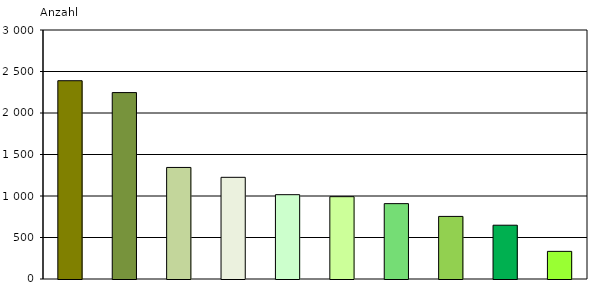
| Category | Series 0 |
|---|---|
| eingeschränkte Erziehungskompetenz der Eltern/Personensorgeberechtigten | 2389 |
| Belastungen des jungen Menschen durch familiäre Konflikte | 2246 |
| Entwicklungsauffälligkeiten/seelische Probleme des jungen Menschen | 1344 |
| Unversorgtheit des jungen Menschen  | 1225 |
| Gefährdung des Kindeswohls | 1016 |
| Belastungen des jungen Menschen durch Problemlagen der Eltern | 992 |
| unzureichende Förderung/Betreuung/Versorgung des jungen Menschen in der Familie | 908 |
| Auffälligkeiten im sozialen Verhalten (dissoziales Verhalten) des jungen Menschen | 754 |
| schulische/berufliche Probleme des jungen Menschen | 648 |
| Übernahme von einem anderen Jugendamt wegen Zuständigkeitswechsel | 333 |